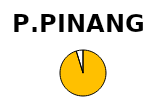
| Category | Series 1 | Series 0 |
|---|---|---|
| Operational Capacity (MW) | 20 | 33.996 |
| In progress (MW) | 1 | 0 |